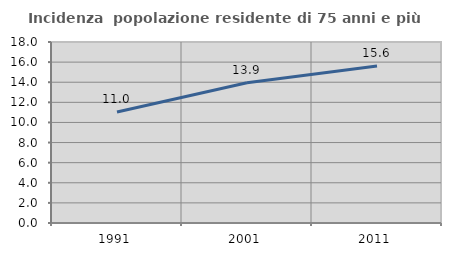
| Category | Incidenza  popolazione residente di 75 anni e più |
|---|---|
| 1991.0 | 11.039 |
| 2001.0 | 13.942 |
| 2011.0 | 15.622 |